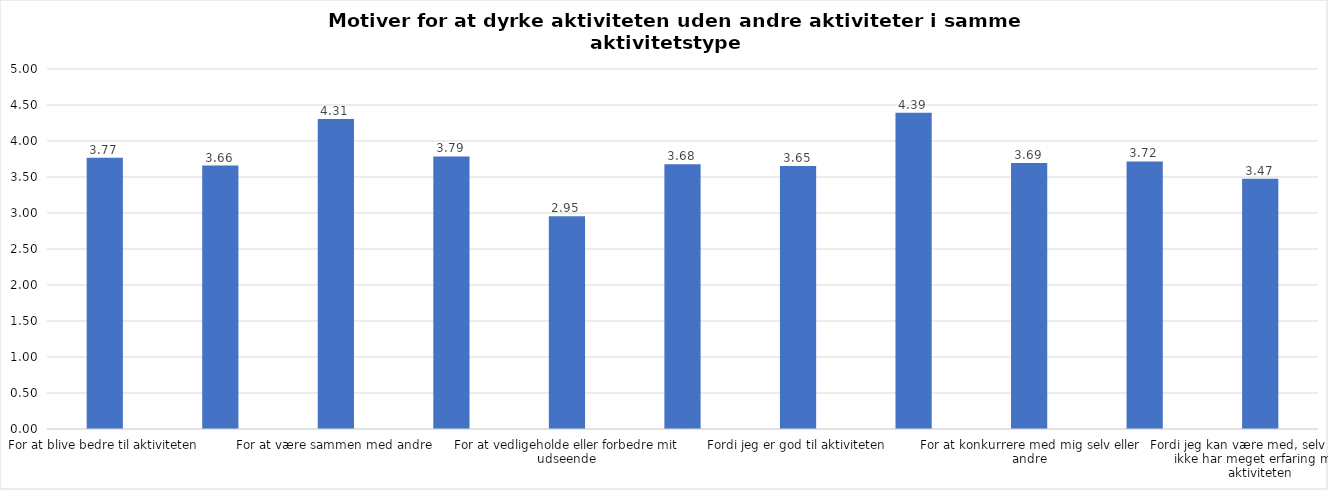
| Category | Gennemsnit |
|---|---|
| For at blive bedre til aktiviteten | 3.769 |
| For at vedligeholde eller forbedre min sundhed (fx helbred, fysisk form) | 3.659 |
| For at være sammen med andre | 4.306 |
| For at gøre noget godt for mig selv | 3.786 |
| For at vedligeholde eller forbedre mit udseende | 2.954 |
| Fordi andre i min omgangskreds opmuntrer mig til det | 3.676 |
| Fordi jeg er god til aktiviteten | 3.653 |
| Fordi jeg godt kan lide aktiviteten | 4.393 |
| For at konkurrere med mig selv eller andre | 3.694 |
| Fordi aktiviteten passer godt ind i min hverdag | 3.717 |
| Fordi jeg kan være med, selv om jeg ikke har meget erfaring med aktiviteten | 3.474 |